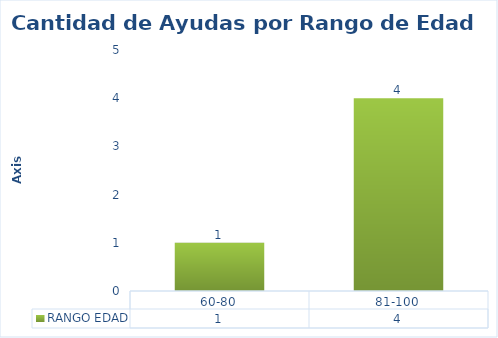
| Category | RANGO EDAD |
|---|---|
| 60-80 | 1 |
| 81-100 | 4 |